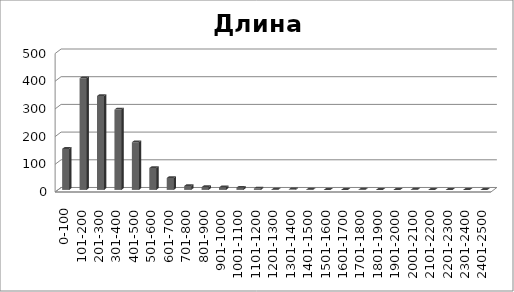
| Category | Series 0 |
|---|---|
| 0-100 | 148 |
| 101-200 | 403 |
| 201-300 | 339 |
| 301-400 | 290 |
| 401-500 | 172 |
| 501-600 | 79 |
| 601-700 | 43 |
| 701-800 | 14 |
| 801-900 | 10 |
| 901-1000 | 9 |
| 1001-1100 | 8 |
| 1101-1200 | 5 |
| 1201-1300 | 1 |
| 1301-1400 | 2 |
| 1401-1500 | 1 |
| 1501-1600 | 0 |
| 1601-1700 | 0 |
| 1701-1800 | 1 |
| 1801-1900 | 0 |
| 1901-2000 | 0 |
| 2001-2100 | 1 |
| 2101-2200 | 0 |
| 2201-2300 | 0 |
| 2301-2400 | 0 |
| 2401-2500 | 0 |